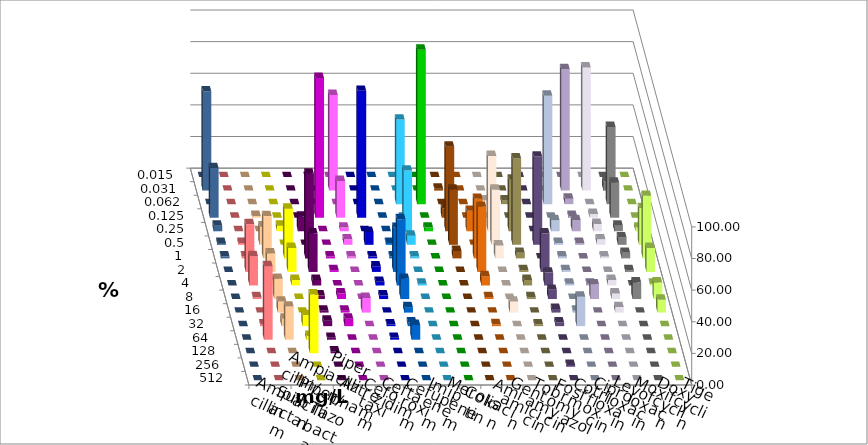
| Category | Ampicillin | Ampicillin/ Sulbactam | Piperacillin | Piperacillin/ Tazobactam | Aztreonam | Cefotaxim | Ceftazidim | Cefuroxim | Imipenem | Meropenem | Colistin | Amikacin | Gentamicin | Tobramycin | Fosfomycin | Cotrimoxazol | Ciprofloxacin | Levofloxacin | Moxifloxacin | Doxycyclin | Tigecyclin |
|---|---|---|---|---|---|---|---|---|---|---|---|---|---|---|---|---|---|---|---|---|---|
| 0.015 | 0 | 0 | 0 | 0 | 0 | 0 | 0 | 0 | 0 | 0 | 0 | 0 | 0 | 0 | 0 | 0 | 0 | 0 | 0 | 0 | 0 |
| 0.031 | 0 | 0 | 0 | 0 | 0 | 60.465 | 0 | 0 | 0 | 0 | 1.163 | 0 | 0 | 0 | 0 | 0 | 76.744 | 77.907 | 5.814 | 0 | 62.791 |
| 0.062 | 0 | 0 | 0 | 0 | 0 | 0 | 0 | 0 | 53.488 | 97.674 | 0 | 0 | 2.326 | 2.326 | 0 | 68.605 | 3.488 | 0 | 48.837 | 0 | 0 |
| 0.125 | 0 | 1.163 | 0 | 0 | 88.372 | 23.256 | 80.233 | 0 | 0 | 0 | 5.814 | 0 | 0 | 0 | 0 | 0 | 1.163 | 2.326 | 22.093 | 0 | 31.395 |
| 0.25 | 0 | 0 | 3.488 | 9.302 | 0 | 2.326 | 0 | 0 | 38.372 | 2.326 | 53.488 | 12.941 | 47.674 | 32.558 | 0 | 6.977 | 6.977 | 4.651 | 3.488 | 2.326 | 3.488 |
| 0.5 | 1.163 | 11.628 | 0 | 0 | 0 | 3.488 | 8.14 | 1.163 | 5.814 | 0 | 34.884 | 0 | 34.884 | 54.651 | 55.814 | 1.163 | 1.163 | 3.488 | 4.651 | 23.256 | 1.163 |
| 1.0 | 1.163 | 26.744 | 31.395 | 53.488 | 1.163 | 1.163 | 1.163 | 1.163 | 1.163 | 0 | 4.651 | 37.647 | 8.14 | 3.488 | 0 | 1.163 | 0 | 1.163 | 3.488 | 39.535 | 1.163 |
| 2.0 | 30.233 | 11.628 | 15.116 | 24.419 | 1.163 | 0 | 3.488 | 27.907 | 0 | 0 | 0 | 41.176 | 0 | 1.163 | 24.419 | 1.163 | 0 | 0 | 1.163 | 15.116 | 0 |
| 4.0 | 18.605 | 3.488 | 3.488 | 3.488 | 0 | 0 | 2.326 | 41.86 | 1.163 | 0 | 0 | 5.882 | 0 | 3.488 | 8.14 | 1.163 | 1.163 | 3.488 | 0 | 1.163 | 0 |
| 8.0 | 1.163 | 12.791 | 0 | 2.326 | 3.488 | 0 | 2.326 | 12.791 | 0 | 0 | 0 | 1.176 | 0 | 1.163 | 5.814 | 0 | 9.302 | 3.488 | 10.465 | 10.465 | 0 |
| 16.0 | 0 | 6.977 | 0 | 1.163 | 1.163 | 9.302 | 0 | 3.488 | 0 | 0 | 0 | 0 | 6.977 | 0 | 2.326 | 1.163 | 0 | 3.488 | 0 | 8.14 | 0 |
| 32.0 | 1.163 | 4.651 | 6.977 | 3.488 | 4.651 | 0 | 1.163 | 2.326 | 0 | 0 | 0 | 1.176 | 0 | 1.163 | 2.326 | 18.605 | 0 | 0 | 0 | 0 | 0 |
| 64.0 | 46.512 | 20.93 | 2.326 | 1.163 | 0 | 0 | 1.163 | 9.302 | 0 | 0 | 0 | 0 | 0 | 0 | 0 | 0 | 0 | 0 | 0 | 0 | 0 |
| 128.0 | 0 | 0 | 37.209 | 1.163 | 0 | 0 | 0 | 0 | 0 | 0 | 0 | 0 | 0 | 0 | 0 | 0 | 0 | 0 | 0 | 0 | 0 |
| 256.0 | 0 | 0 | 0 | 0 | 0 | 0 | 0 | 0 | 0 | 0 | 0 | 0 | 0 | 0 | 1.163 | 0 | 0 | 0 | 0 | 0 | 0 |
| 512.0 | 0 | 0 | 0 | 0 | 0 | 0 | 0 | 0 | 0 | 0 | 0 | 0 | 0 | 0 | 0 | 0 | 0 | 0 | 0 | 0 | 0 |